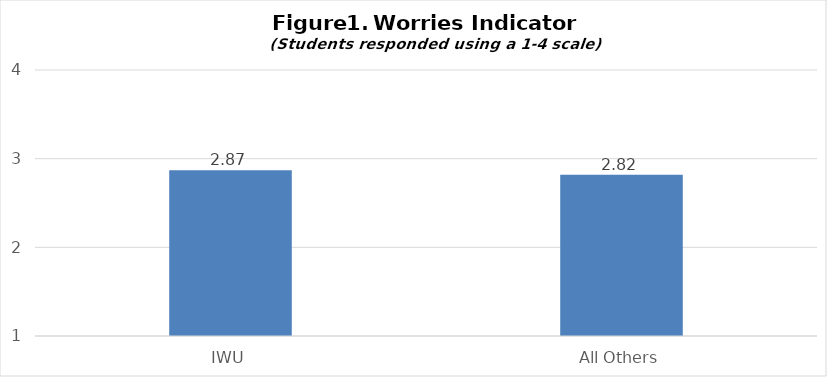
| Category | IWU |
|---|---|
| IWU | 2.87 |
| All Others | 2.82 |